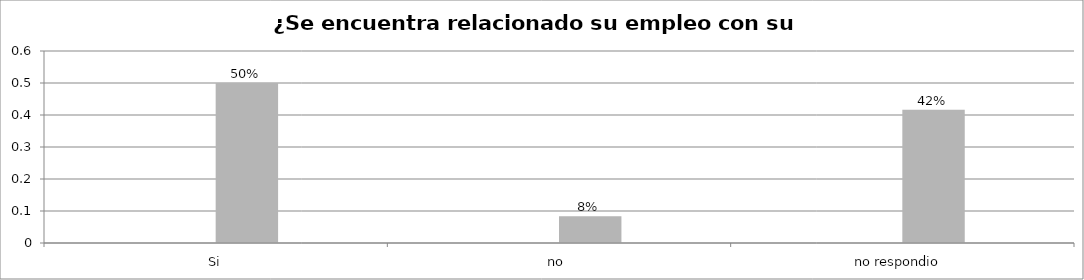
| Category | Series 0 | Series 1 | Series 2 | Series 3 |
|---|---|---|---|---|
| Si |  |  | 0.5 |  |
| no  |  |  | 0.083 |  |
| no respondio  |  |  | 0.417 |  |